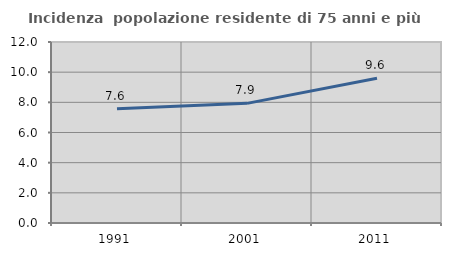
| Category | Incidenza  popolazione residente di 75 anni e più |
|---|---|
| 1991.0 | 7.57 |
| 2001.0 | 7.932 |
| 2011.0 | 9.596 |